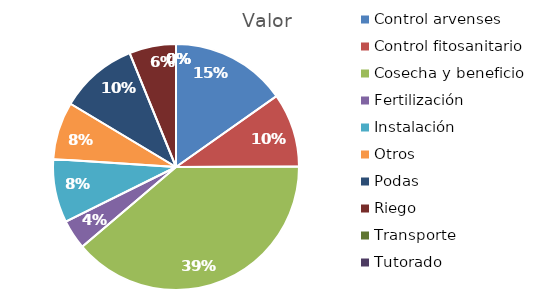
| Category | Valor |
|---|---|
| Control arvenses | 7924764 |
| Control fitosanitario | 5058360 |
| Cosecha y beneficio | 20233440 |
| Fertilización | 2023344 |
| Instalación | 4357597 |
| Otros | 3934280 |
| Podas | 5339380 |
| Riego | 3203628 |
| Transporte | 0 |
| Tutorado | 0 |